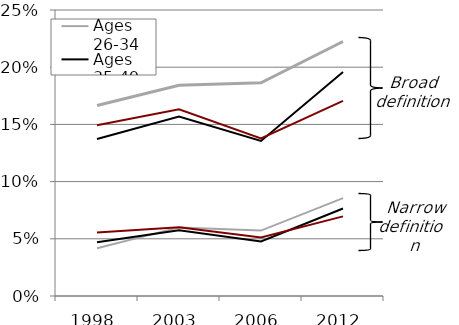
| Category | Ages 26-34 | Ages 35-49 | Ages 50-62 |
|---|---|---|---|
| 1998.0 | 0.166 | 0.137 | 0.149 |
| 2003.0 | 0.184 | 0.157 | 0.163 |
| 2006.0 | 0.186 | 0.136 | 0.138 |
| 2012.0 | 0.222 | 0.196 | 0.171 |